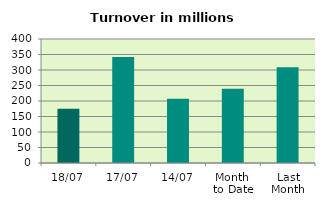
| Category | Series 0 |
|---|---|
| 18/07 | 174.938 |
| 17/07 | 342.114 |
| 14/07 | 207.396 |
| Month 
to Date | 239.232 |
| Last
Month | 308.534 |